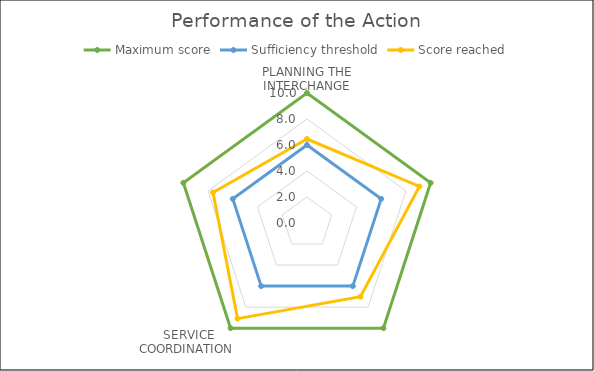
| Category | Maximum score | Sufficiency threshold | Score reached |
|---|---|---|---|
| PLANNING THE INTERCHANGE | 10 | 6 | 6.462 |
| SERVICE COORDINATION  | 10 | 6 | 9.091 |
| SERVICE INFORMATION | 10 | 6 | 7 |
| CHANGING BEHAVIOURS | 10 | 6 | 9.091 |
| POLICY, NORMS, AND REGULATIONS | 10 | 6 | 7.6 |